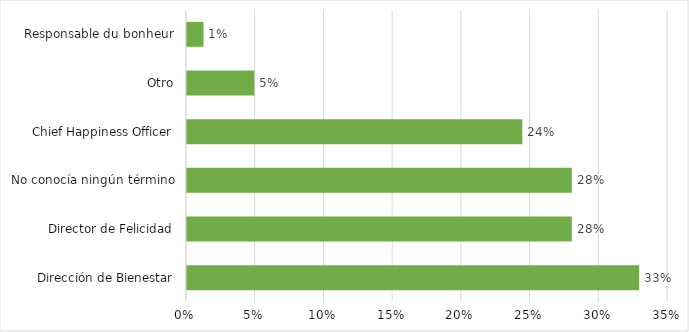
| Category | Series 0 |
|---|---|
| Dirección de Bienestar | 0.329 |
| Director de Felicidad | 0.28 |
| No conocía ningún término | 0.28 |
| Chief Happiness Officer | 0.244 |
| Otro | 0.049 |
| Responsable du bonheur | 0.012 |